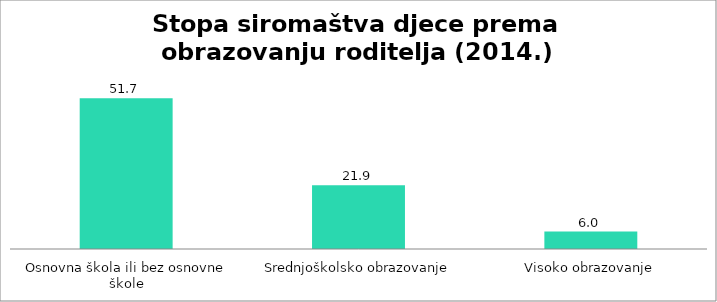
| Category | Stopa |
|---|---|
| Osnovna škola ili bez osnovne škole | 51.7 |
| Srednjoškolsko obrazovanje | 21.9 |
| Visoko obrazovanje | 6 |